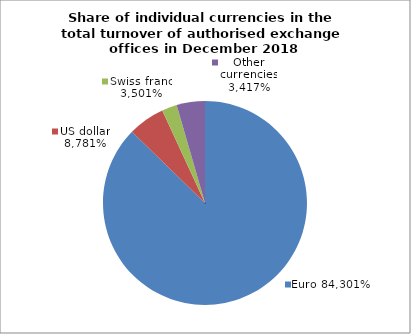
| Category | EUR |
|---|---|
| 0 | 0.873 |
| 1 | 0.058 |
| 2 | 0.024 |
| 3 | 0.045 |